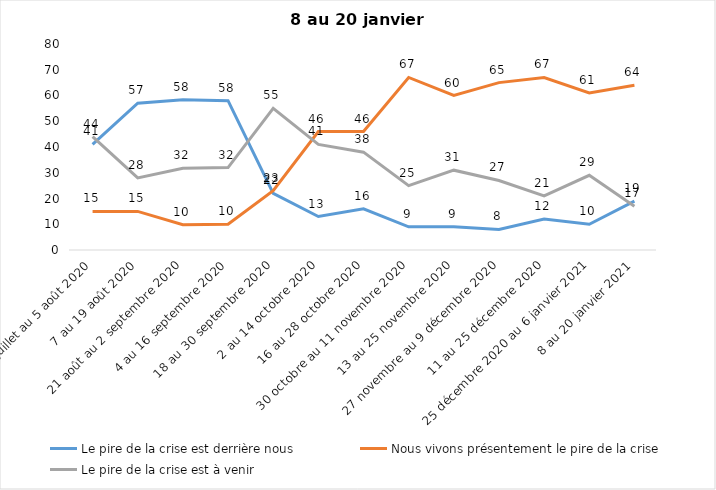
| Category | Le pire de la crise est derrière nous | Nous vivons présentement le pire de la crise | Le pire de la crise est à venir |
|---|---|---|---|
| 24 juillet au 5 août 2020 | 41 | 15 | 44 |
| 7 au 19 août 2020 | 57 | 15 | 28 |
| 21 août au 2 septembre 2020 | 58.39 | 9.84 | 31.77 |
| 4 au 16 septembre 2020 | 58 | 10 | 32 |
| 18 au 30 septembre 2020 | 22 | 23 | 55 |
| 2 au 14 octobre 2020 | 13 | 46 | 41 |
| 16 au 28 octobre 2020 | 16 | 46 | 38 |
| 30 octobre au 11 novembre 2020 | 9 | 67 | 25 |
| 13 au 25 novembre 2020 | 9 | 60 | 31 |
| 27 novembre au 9 décembre 2020 | 8 | 65 | 27 |
| 11 au 25 décembre 2020 | 12 | 67 | 21 |
| 25 décembre 2020 au 6 janvier 2021 | 10 | 61 | 29 |
| 8 au 20 janvier 2021 | 19 | 64 | 17 |